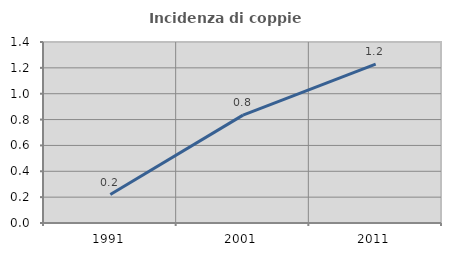
| Category | Incidenza di coppie miste |
|---|---|
| 1991.0 | 0.22 |
| 2001.0 | 0.835 |
| 2011.0 | 1.228 |